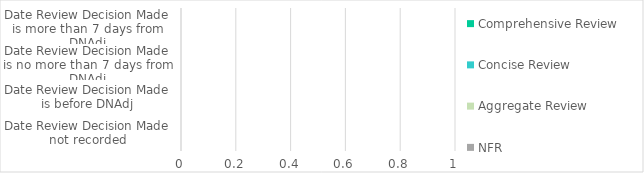
| Category | Comprehensive Review | Concise Review | Aggregate Review | NFR |
|---|---|---|---|---|
| Date Review Decision Made not recorded | 0 | 0 | 0 | 0 |
| Date Review Decision Made is before DNAdj | 0 | 0 | 0 | 0 |
| Date Review Decision Made is no more than 7 days from DNAdj | 0 | 0 | 0 | 0 |
| Date Review Decision Made is more than 7 days from DNAdj | 0 | 0 | 0 | 0 |